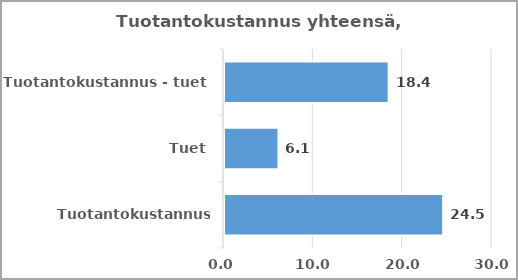
| Category | Series 0 |
|---|---|
| Tuotantokustannus yhteensä | 24.53 |
| Tuet | 6.098 |
| Tuotantokustannus - tuet | 18.431 |